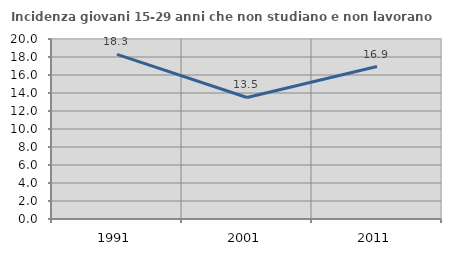
| Category | Incidenza giovani 15-29 anni che non studiano e non lavorano  |
|---|---|
| 1991.0 | 18.298 |
| 2001.0 | 13.5 |
| 2011.0 | 16.942 |